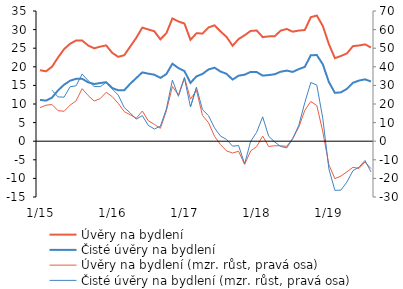
| Category | Úvěry na bydlení | Čisté úvěry na bydlení |
|---|---|---|
|  1/15 | 19.084 | 11.095 |
| 2 | 18.787 | 10.905 |
| 3 | 20.029 | 11.729 |
| 4 | 22.529 | 13.661 |
| 5 | 24.752 | 15.182 |
| 6 | 26.195 | 16.267 |
| 7 | 27.076 | 16.771 |
| 8 | 27.066 | 16.781 |
| 9 | 25.73 | 15.828 |
| 10 | 24.967 | 15.375 |
| 11 | 25.42 | 15.639 |
| 12 | 25.743 | 15.861 |
|  1/16 | 23.745 | 14.299 |
| 2 | 22.673 | 13.678 |
| 3 | 23.115 | 13.704 |
| 4 | 25.469 | 15.456 |
| 5 | 27.807 | 16.98 |
| 6 | 30.54 | 18.499 |
| 7 | 30.042 | 18.154 |
| 8 | 29.555 | 17.875 |
| 9 | 27.388 | 17.023 |
| 10 | 29.036 | 18.044 |
| 11 | 33.011 | 20.829 |
| 12 | 32.18 | 19.665 |
|  1/17 | 31.63 | 18.86 |
| 2 | 27.255 | 15.667 |
| 3 | 29.015 | 17.424 |
| 4 | 28.955 | 18.083 |
| 5 | 30.579 | 19.281 |
| 6 | 31.145 | 19.759 |
| 7 | 29.509 | 18.73 |
| 8 | 28.03 | 18.11 |
| 9 | 25.655 | 16.561 |
| 10 | 27.462 | 17.612 |
| 11 | 28.474 | 17.888 |
| 12 | 29.638 | 18.625 |
|  1/18 | 29.767 | 18.587 |
| 2 | 27.982 | 17.635 |
| 3 | 28.173 | 17.779 |
| 4 | 28.224 | 17.994 |
| 5 | 29.726 | 18.68 |
| 6 | 30.168 | 18.974 |
| 7 | 29.437 | 18.624 |
| 8 | 29.74 | 19.378 |
| 9 | 29.882 | 19.973 |
| 10 | 33.339 | 23.116 |
| 11 | 33.777 | 23.15 |
| 12 | 30.953 | 20.646 |
|  1/19 | 26.1 | 15.915 |
| 2 | 22.327 | 12.995 |
| 3 | 22.899 | 13.133 |
| 4 | 23.601 | 14.069 |
| 5 | 25.548 | 15.695 |
| 6 | 25.733 | 16.297 |
| 7 | 26.022 | 16.623 |
| 8 | 25.198 | 16.052 |